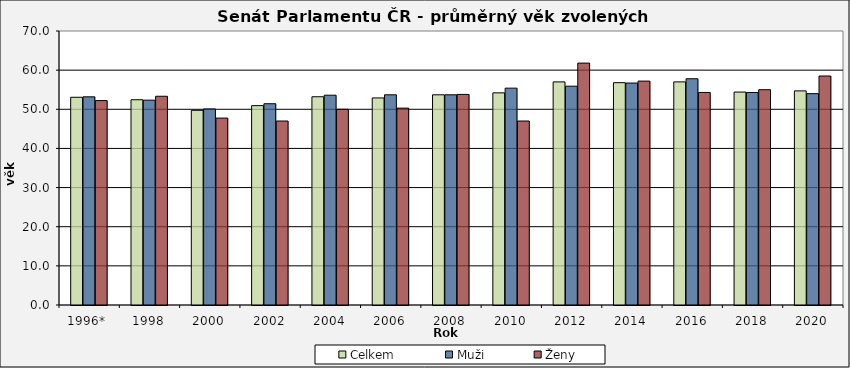
| Category | Celkem | Muži | Ženy |
|---|---|---|---|
| 1996*  | 53.07 | 53.18 | 52.22 |
| 1998 | 52.44 | 52.33 | 53.33 |
| 2000 | 49.74 | 50.09 | 47.75 |
| 2002 | 50.93 | 51.42 | 47 |
| 2004 | 53.2 | 53.6 | 50 |
| 2006 | 52.9 | 53.7 | 50.3 |
| 2008 | 53.7 | 53.7 | 53.8 |
| 2010 | 54.2 | 55.4 | 47 |
| 2012 | 57 | 55.9 | 61.8 |
| 2014 | 56.8 | 56.7 | 57.2 |
| 2016 | 57 | 57.8 | 54.3 |
| 2018 | 54.4 | 54.3 | 55 |
| 2020 | 54.7 | 54 | 58.5 |